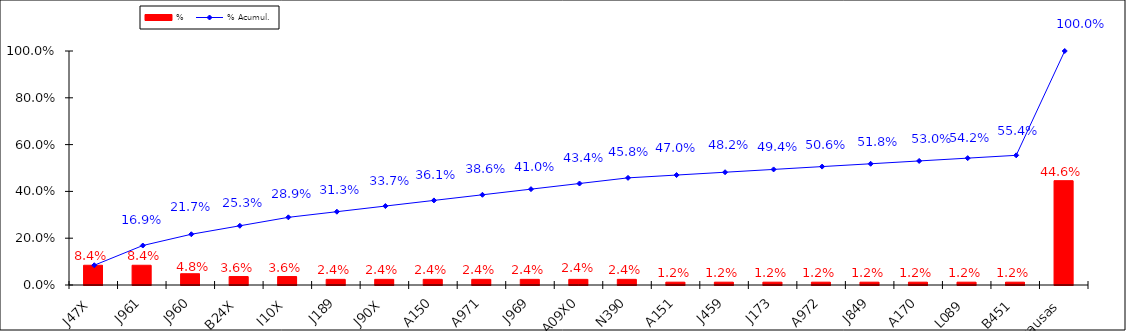
| Category | % |
|---|---|
| J47X | 0.084 |
| J961 | 0.084 |
| J960 | 0.048 |
| B24X | 0.036 |
| I10X | 0.036 |
| J189 | 0.024 |
| J90X | 0.024 |
| A150 | 0.024 |
| A971 | 0.024 |
| J969 | 0.024 |
| A09X0 | 0.024 |
| N390 | 0.024 |
| A151 | 0.012 |
| J459 | 0.012 |
| J173 | 0.012 |
| A972 | 0.012 |
| J849 | 0.012 |
| A170 | 0.012 |
| L089 | 0.012 |
| B451 | 0.012 |
| Otras causas | 0.446 |